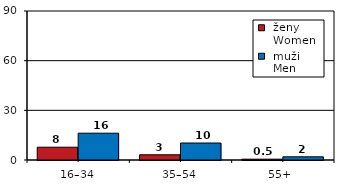
| Category |  ženy 
 Women |  muži 
 Men |
|---|---|---|
| 16–34 | 7.722 | 16.188 |
| 35–54 | 3.152 | 10.252 |
| 55+  | 0.493 | 1.916 |